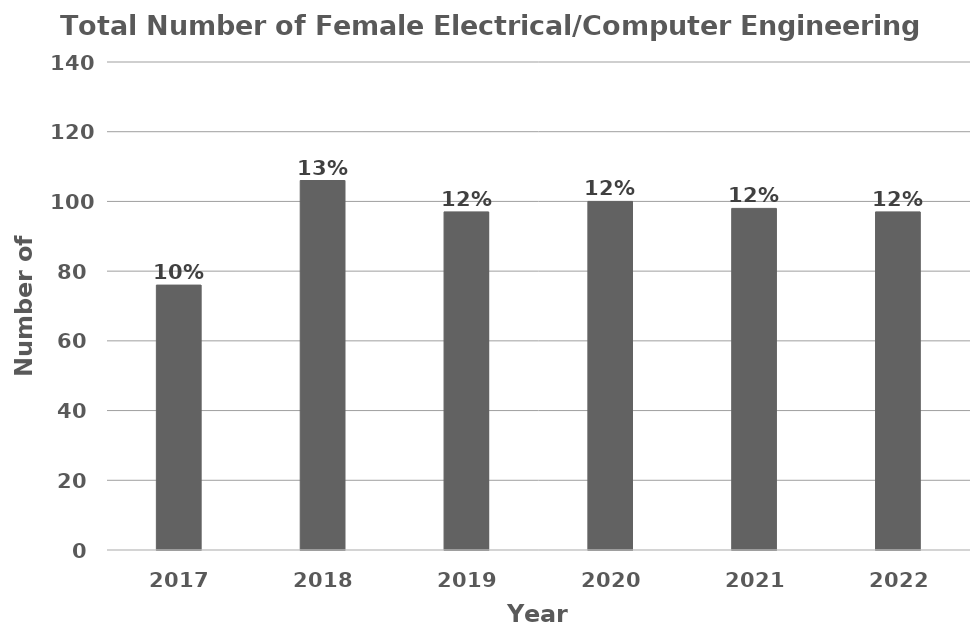
| Category | Total Number of Female Electrical Engineering Students |
|---|---|
| 2017.0 | 76 |
| 2018.0 | 106 |
| 2019.0 | 97 |
| 2020.0 | 100 |
| 2021.0 | 98 |
| 2022.0 | 97 |